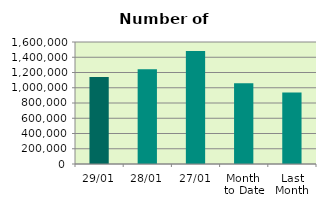
| Category | Series 0 |
|---|---|
| 29/01 | 1140236 |
| 28/01 | 1244086 |
| 27/01 | 1481000 |
| Month 
to Date | 1057409.7 |
| Last
Month | 938735.9 |